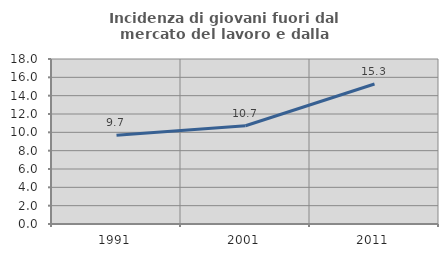
| Category | Incidenza di giovani fuori dal mercato del lavoro e dalla formazione  |
|---|---|
| 1991.0 | 9.677 |
| 2001.0 | 10.714 |
| 2011.0 | 15.278 |